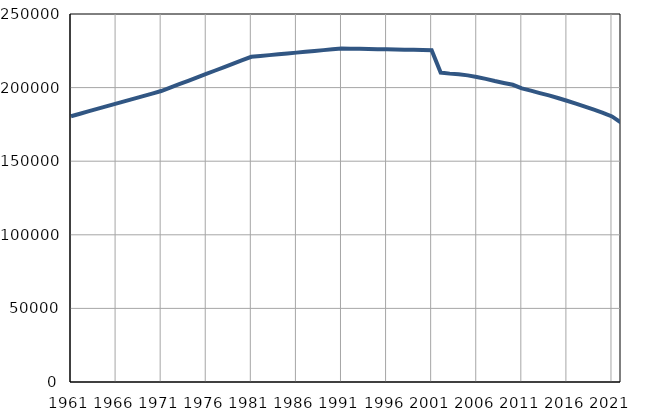
| Category | Population
size |
|---|---|
| 1961.0 | 180558 |
| 1962.0 | 182268 |
| 1963.0 | 183978 |
| 1964.0 | 185687 |
| 1965.0 | 187397 |
| 1966.0 | 189107 |
| 1967.0 | 190817 |
| 1968.0 | 192527 |
| 1969.0 | 194236 |
| 1970.0 | 195946 |
| 1971.0 | 197656 |
| 1972.0 | 199983 |
| 1973.0 | 202311 |
| 1974.0 | 204638 |
| 1975.0 | 206965 |
| 1976.0 | 209293 |
| 1977.0 | 211620 |
| 1978.0 | 213948 |
| 1979.0 | 216275 |
| 1980.0 | 218603 |
| 1981.0 | 220930 |
| 1982.0 | 221496 |
| 1983.0 | 222062 |
| 1984.0 | 222628 |
| 1985.0 | 223194 |
| 1986.0 | 223760 |
| 1987.0 | 224325 |
| 1988.0 | 224891 |
| 1989.0 | 225457 |
| 1990.0 | 226023 |
| 1991.0 | 226589 |
| 1992.0 | 226472 |
| 1993.0 | 226355 |
| 1994.0 | 226239 |
| 1995.0 | 226122 |
| 1996.0 | 226005 |
| 1997.0 | 225888 |
| 1998.0 | 225771 |
| 1999.0 | 225654 |
| 2000.0 | 225538 |
| 2001.0 | 225421 |
| 2002.0 | 210183 |
| 2003.0 | 209491 |
| 2004.0 | 209031 |
| 2005.0 | 208297 |
| 2006.0 | 207217 |
| 2007.0 | 205911 |
| 2008.0 | 204442 |
| 2009.0 | 203118 |
| 2010.0 | 201908 |
| 2011.0 | 199497 |
| 2012.0 | 197963 |
| 2013.0 | 196285 |
| 2014.0 | 194701 |
| 2015.0 | 192934 |
| 2016.0 | 191054 |
| 2017.0 | 189091 |
| 2018.0 | 187003 |
| 2019.0 | 184994 |
| 2020.0 | 182895 |
| 2021.0 | 180400 |
| 2022.0 | 176202 |